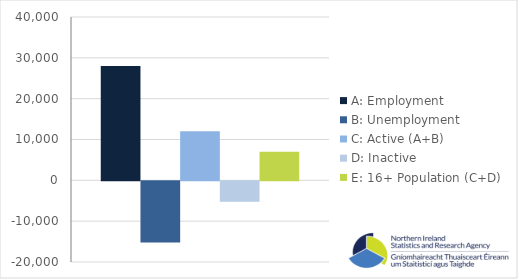
| Category | A: Employment | B: Unemployment | C: Active (A+B) | D: Inactive | E: 16+ Population (C+D) |
|---|---|---|---|---|---|
| 0 | 28000 | -15000 | 12000 | -5000 | 7000 |